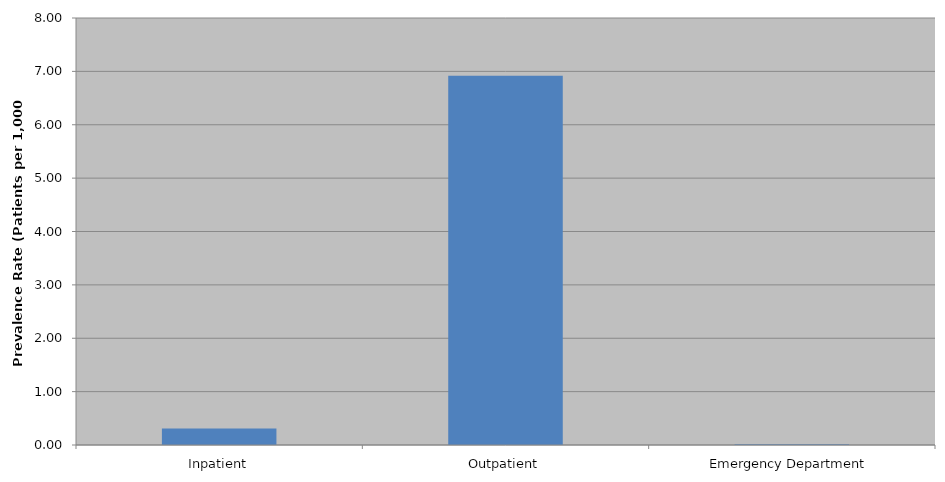
| Category | Total |
|---|---|
| Inpatient | 0.31 |
| Outpatient | 6.917 |
| Emergency Department | 0.012 |